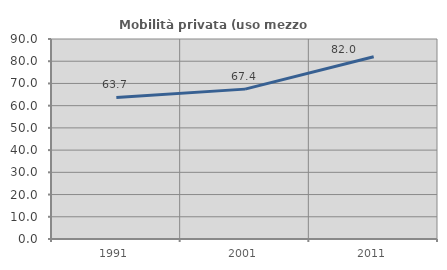
| Category | Mobilità privata (uso mezzo privato) |
|---|---|
| 1991.0 | 63.678 |
| 2001.0 | 67.445 |
| 2011.0 | 82.027 |